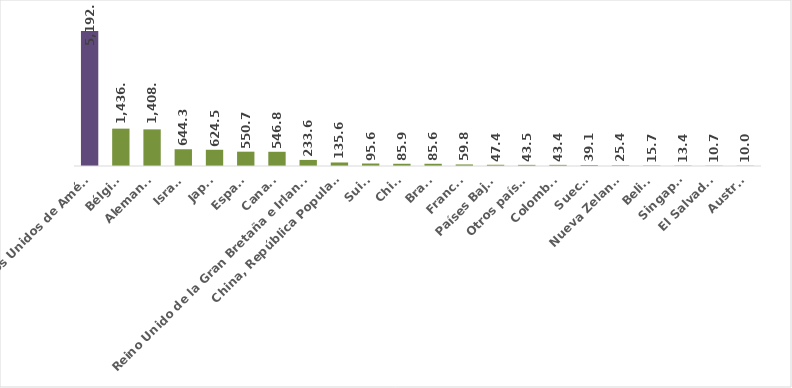
| Category | Acum 2013-2018 |
|---|---|
| Estados Unidos de América | 5192.402 |
| Bélgica | 1436.722 |
| Alemania | 1408.773 |
| Israel | 644.304 |
| Japón | 624.452 |
| España | 550.749 |
| Canadá | 546.834 |
| Reino Unido de la Gran Bretaña e Irlanda del Norte | 233.607 |
| China, República Popular de | 135.579 |
| Suiza | 95.619 |
| Chile | 85.943 |
| Brasil | 85.582 |
| Francia | 59.834 |
| Países Bajos | 47.401 |
| Otros países | 43.543 |
| Colombia | 43.382 |
| Suecia | 39.107 |
| Nueva Zelandia | 25.413 |
| Belice | 15.662 |
| Singapur | 13.439 |
| El Salvador | 10.665 |
| Austria | 10.016 |